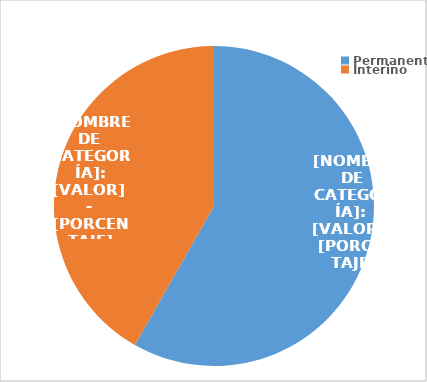
| Category | Series 0 |
|---|---|
| Permanente | 3225 |
| Interino | 2313 |